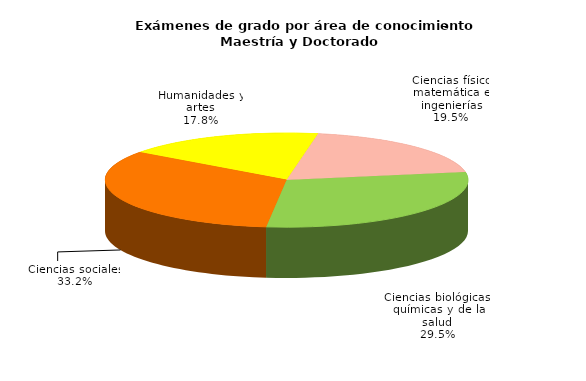
| Category | Series 0 |
|---|---|
| Ciencias físico matemática e ingenierías | 0.195 |
| Ciencias biológicas, químicas y de la salud | 0.295 |
| Ciencias sociales | 0.332 |
| Humanidades y artes | 0.178 |